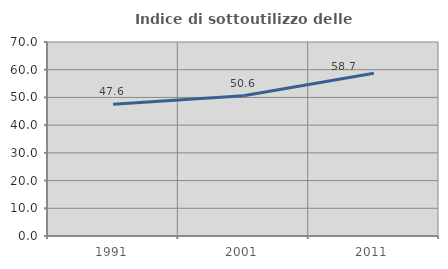
| Category | Indice di sottoutilizzo delle abitazioni  |
|---|---|
| 1991.0 | 47.556 |
| 2001.0 | 50.622 |
| 2011.0 | 58.744 |